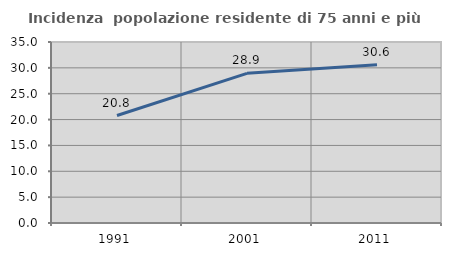
| Category | Incidenza  popolazione residente di 75 anni e più |
|---|---|
| 1991.0 | 20.784 |
| 2001.0 | 28.934 |
| 2011.0 | 30.597 |